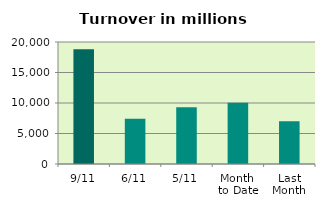
| Category | Series 0 |
|---|---|
| 9/11 | 18829.504 |
| 6/11 | 7411.731 |
| 5/11 | 9295.584 |
| Month 
to Date | 10053.351 |
| Last
Month | 7023.861 |